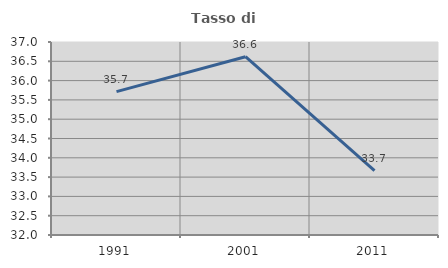
| Category | Tasso di occupazione   |
|---|---|
| 1991.0 | 35.714 |
| 2001.0 | 36.62 |
| 2011.0 | 33.67 |